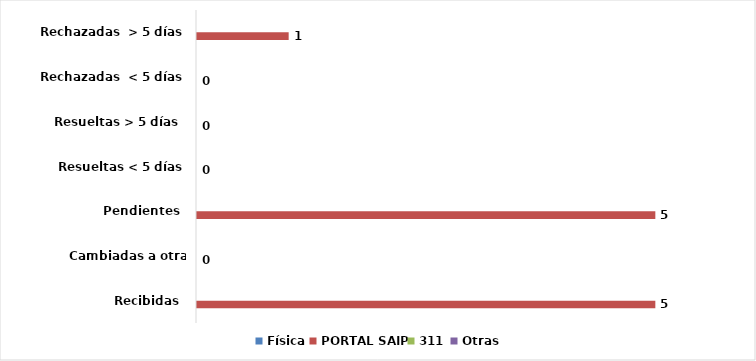
| Category | Física | PORTAL SAIP | 311 | Otras |
|---|---|---|---|---|
| Recibidas  | 0 | 5 | 0 | 0 |
| Cambiadas a otra institución | 0 | 0 | 0 | 0 |
| Pendientes  | 0 | 5 | 0 | 0 |
| Resueltas < 5 días | 0 | 0 | 0 | 0 |
| Resueltas > 5 días  | 0 | 0 | 0 | 0 |
| Rechazadas  < 5 días | 0 | 0 | 0 | 0 |
| Rechazadas  > 5 días | 0 | 1 | 0 | 0 |